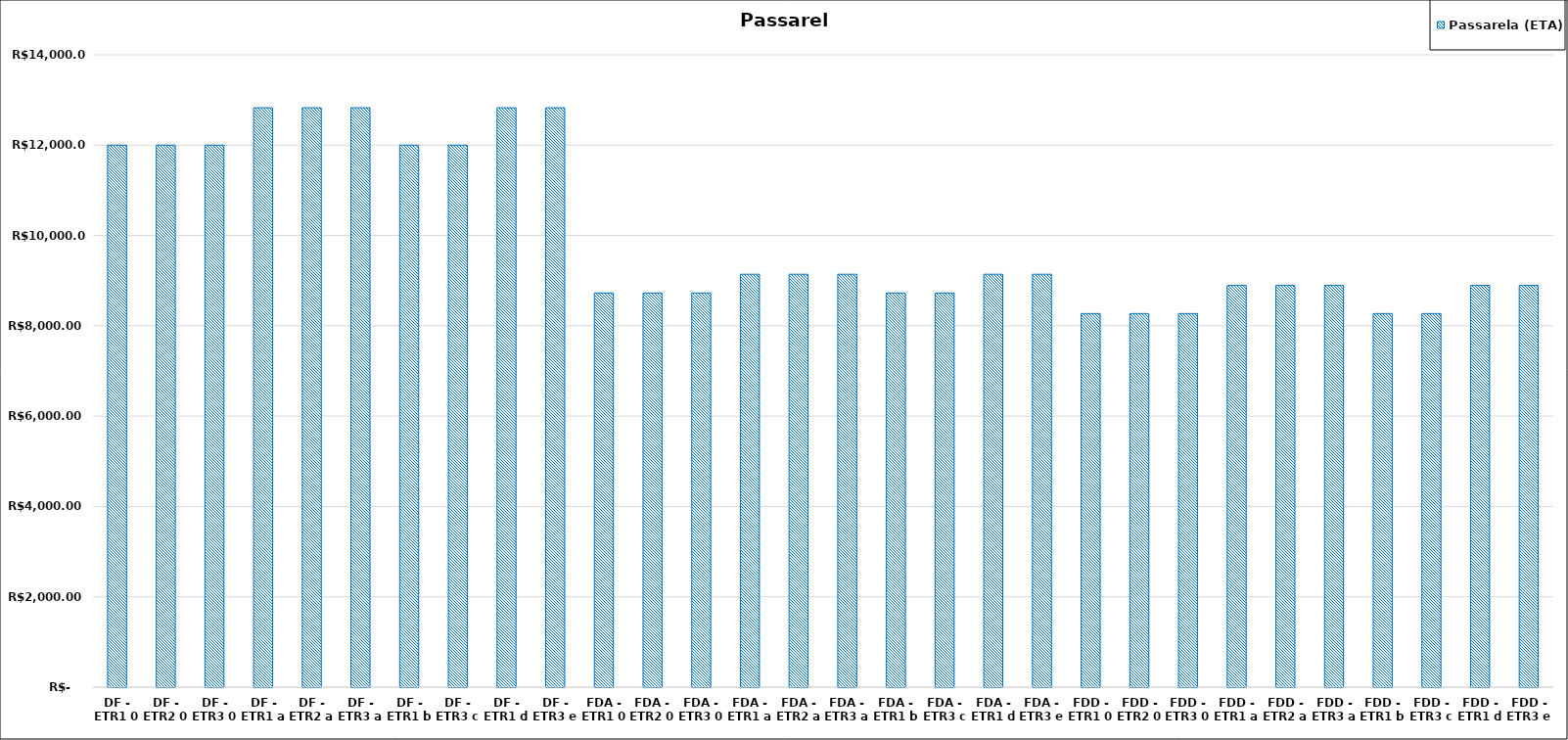
| Category | Passarela (ETA) |
|---|---|
| DF - ETR1 0 | 12000.382 |
| DF - ETR2 0 | 12000.382 |
| DF - ETR3 0 | 12000.382 |
| DF - ETR1 a | 12827.842 |
| DF - ETR2 a | 12827.842 |
| DF - ETR3 a | 12827.842 |
| DF - ETR1 b | 12000.382 |
| DF - ETR3 c | 12000.382 |
| DF - ETR1 d | 12827.842 |
| DF - ETR3 e | 12827.842 |
| FDA - ETR1 0 | 8726.748 |
| FDA - ETR2 0 | 8726.748 |
| FDA - ETR3 0 | 8726.748 |
| FDA - ETR1 a | 9141.132 |
| FDA - ETR2 a | 9141.132 |
| FDA - ETR3 a | 9141.132 |
| FDA - ETR1 b | 8726.748 |
| FDA - ETR3 c | 8726.748 |
| FDA - ETR1 d | 9141.132 |
| FDA - ETR3 e | 9141.132 |
| FDD - ETR1 0 | 8271.132 |
| FDD - ETR2 0 | 8271.132 |
| FDD - ETR3 0 | 8271.132 |
| FDD - ETR1 a | 8893.984 |
| FDD - ETR2 a | 8893.984 |
| FDD - ETR3 a | 8893.984 |
| FDD - ETR1 b | 8271.132 |
| FDD - ETR3 c | 8271.132 |
| FDD - ETR1 d | 8893.984 |
| FDD - ETR3 e | 8893.984 |